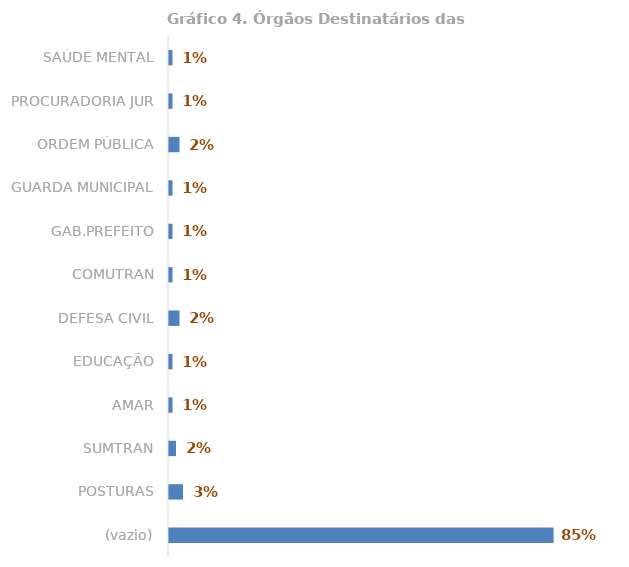
| Category | Total |
|---|---|
| (vazio) | 0.853 |
| POSTURAS | 0.031 |
| SUMTRAN | 0.016 |
| AMAR | 0.008 |
| EDUCAÇÃO | 0.008 |
| DEFESA CIVIL | 0.023 |
| COMUTRAN | 0.008 |
| GAB.PREFEITO | 0.008 |
| GUARDA MUNICIPAL | 0.008 |
| ORDEM PÚBLICA | 0.023 |
| PROCURADORIA JUR | 0.008 |
| SAÚDE MENTAL | 0.008 |